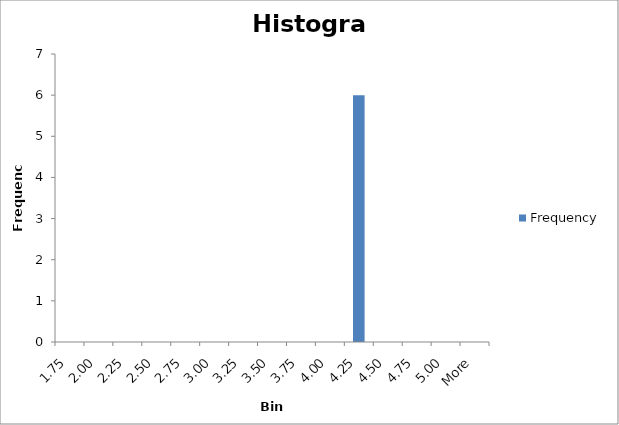
| Category | Frequency |
|---|---|
| 1.75 | 0 |
| 2.00 | 0 |
| 2.25 | 0 |
| 2.50 | 0 |
| 2.75 | 0 |
| 3.00 | 0 |
| 3.25 | 0 |
| 3.50 | 0 |
| 3.75 | 0 |
| 4.00 | 0 |
| 4.25 | 6 |
| 4.50 | 0 |
| 4.75 | 0 |
| 5.00 | 0 |
| More | 0 |